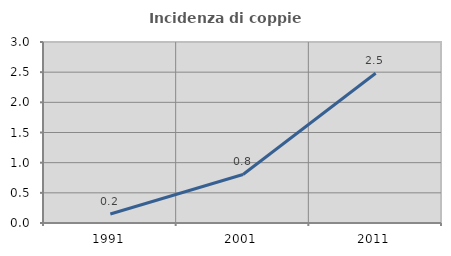
| Category | Incidenza di coppie miste |
|---|---|
| 1991.0 | 0.15 |
| 2001.0 | 0.805 |
| 2011.0 | 2.481 |